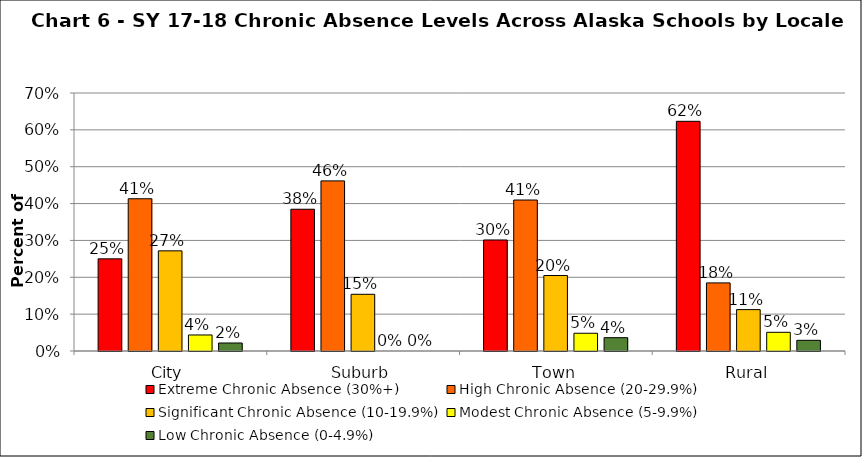
| Category | Extreme Chronic Absence (30%+) | High Chronic Absence (20-29.9%) | Significant Chronic Absence (10-19.9%) | Modest Chronic Absence (5-9.9%) | Low Chronic Absence (0-4.9%) |
|---|---|---|---|---|---|
| 0 | 0.25 | 0.413 | 0.272 | 0.043 | 0.022 |
| 1 | 0.385 | 0.462 | 0.154 | 0 | 0 |
| 2 | 0.301 | 0.41 | 0.205 | 0.048 | 0.036 |
| 3 | 0.623 | 0.185 | 0.112 | 0.051 | 0.029 |